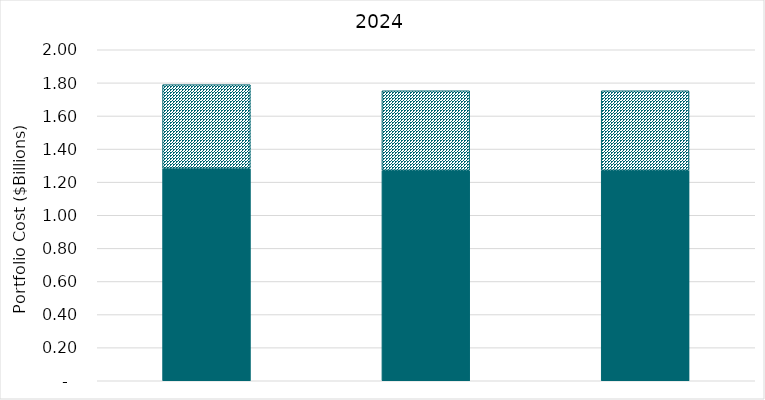
| Category | Revenue Requirement | SCGHG |
|---|---|---|
| 2023 EPR Preferred Portfolio | 1.283 | 0.506 |
| Reference | 1.272 | 0.481 |
| Reference SCGHG in Dispatch | 1.272 | 0.481 |